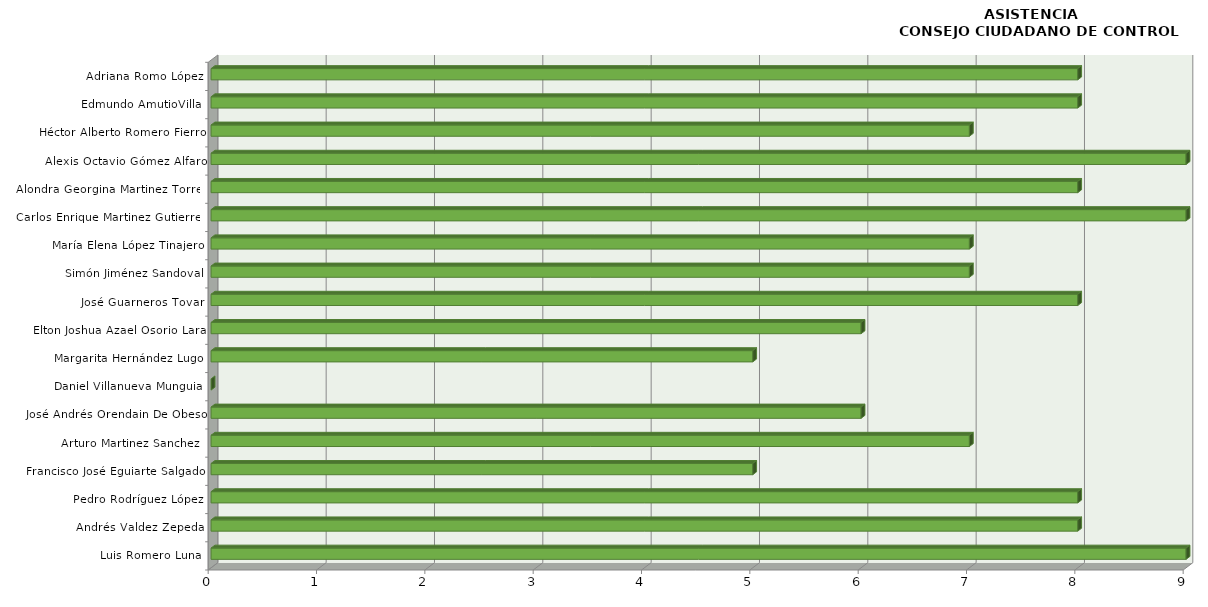
| Category | Series 0 |
|---|---|
| Luis Romero Luna | 9 |
| Andrés Valdez Zepeda | 8 |
| Pedro Rodríguez López | 8 |
| Francisco José Eguiarte Salgado | 5 |
| Arturo Martinez Sanchez  | 7 |
| José Andrés Orendain De Obeso | 6 |
| Daniel Villanueva Munguia | 0 |
| Margarita Hernández Lugo | 5 |
| Elton Joshua Azael Osorio Lara | 6 |
| José Guarneros Tovar | 8 |
| Simón Jiménez Sandoval | 7 |
| María Elena López Tinajero | 7 |
| Carlos Enrique Martinez Gutierrez | 9 |
| Alondra Georgina Martinez Torres | 8 |
| Alexis Octavio Gómez Alfaro | 9 |
| Héctor Alberto Romero Fierro | 7 |
| Edmundo AmutioVilla | 8 |
| Adriana Romo López | 8 |